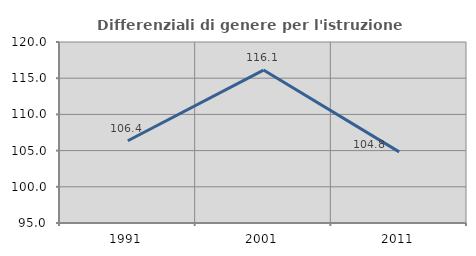
| Category | Differenziali di genere per l'istruzione superiore |
|---|---|
| 1991.0 | 106.355 |
| 2001.0 | 116.124 |
| 2011.0 | 104.822 |